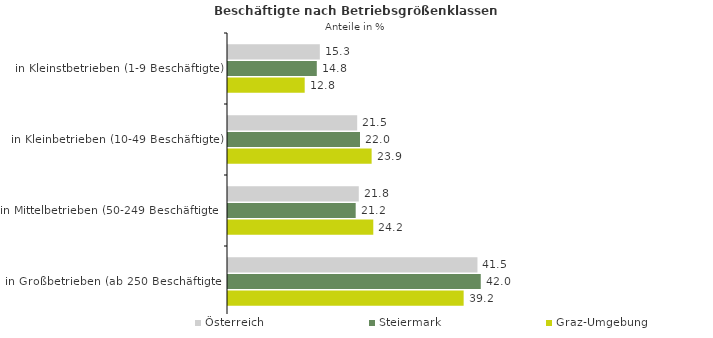
| Category | Österreich | Steiermark | Graz-Umgebung |
|---|---|---|---|
| in Kleinstbetrieben (1-9 Beschäftigte) | 15.273 | 14.768 | 12.756 |
| in Kleinbetrieben (10-49 Beschäftigte) | 21.487 | 21.955 | 23.888 |
| in Mittelbetrieben (50-249 Beschäftigte) | 21.75 | 21.237 | 24.164 |
| in Großbetrieben (ab 250 Beschäftigte) | 41.489 | 42.04 | 39.193 |